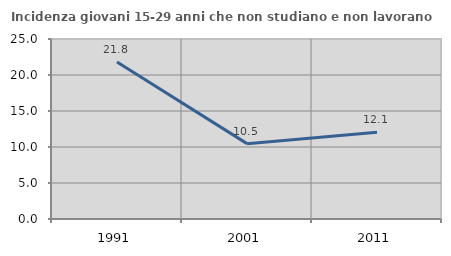
| Category | Incidenza giovani 15-29 anni che non studiano e non lavorano  |
|---|---|
| 1991.0 | 21.802 |
| 2001.0 | 10.467 |
| 2011.0 | 12.054 |